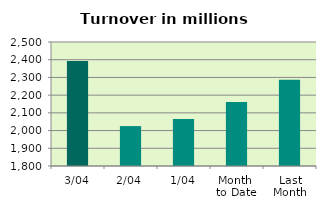
| Category | Series 0 |
|---|---|
| 3/04 | 2392.81 |
| 2/04 | 2025.341 |
| 1/04 | 2064.644 |
| Month 
to Date | 2160.931 |
| Last
Month | 2286.259 |